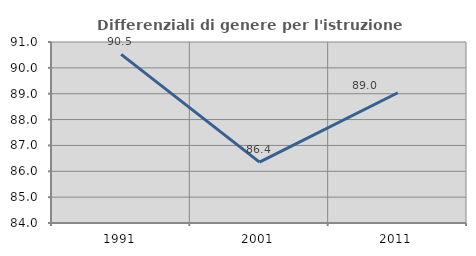
| Category | Differenziali di genere per l'istruzione superiore |
|---|---|
| 1991.0 | 90.52 |
| 2001.0 | 86.355 |
| 2011.0 | 89.038 |